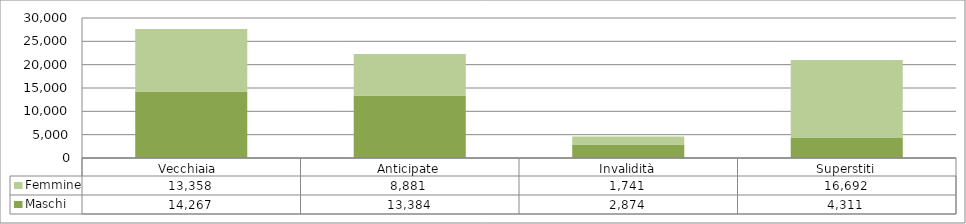
| Category | Maschi | Femmine |
|---|---|---|
| Vecchiaia  | 14267 | 13358 |
| Anticipate | 13384 | 8881 |
| Invalidità | 2874 | 1741 |
| Superstiti | 4311 | 16692 |